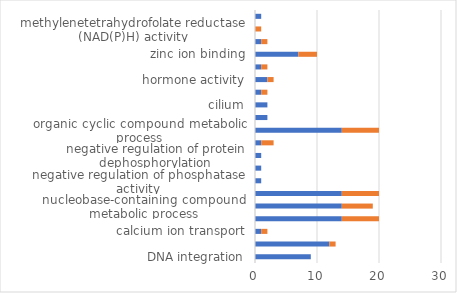
| Category | up | down |
|---|---|---|
| DNA integration | 9 | 0 |
| DNA metabolic process | 12 | 1 |
| calcium ion transport | 1 | 1 |
| heterocycle metabolic process | 14 | 6 |
| nucleobase-containing compound metabolic process | 14 | 5 |
| cellular aromatic compound metabolic process | 14 | 6 |
| negative regulation of phosphatase activity | 1 | 0 |
| negative regulation of dephosphorylation | 1 | 0 |
| negative regulation of protein dephosphorylation | 1 | 0 |
| divalent inorganic cation transport | 1 | 2 |
| organic cyclic compound metabolic process | 14 | 6 |
| motile cilium | 2 | 0 |
| cilium | 2 | 0 |
| ATPase regulator activity | 1 | 1 |
| hormone activity | 2 | 1 |
| ATPase inhibitor activity | 1 | 1 |
| zinc ion binding | 7 | 3 |
| calcium channel regulator activity | 1 | 1 |
| methylenetetrahydrofolate reductase (NAD(P)H) activity | 0 | 1 |
| phosphatase binding | 1 | 0 |